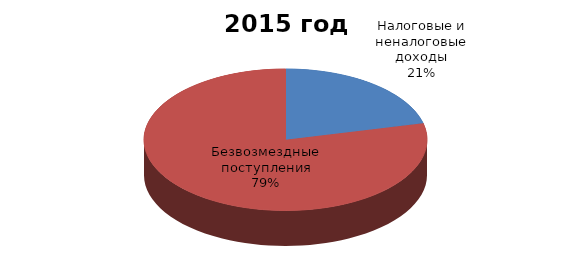
| Category | 2015 год (ожидаемое) |
|---|---|
| Налоговые и неналоговые доходы | 381209.04 |
| Безвозмездные поступления | 1409840.31 |